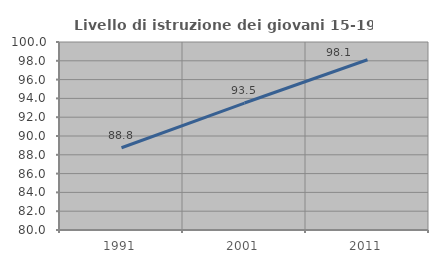
| Category | Livello di istruzione dei giovani 15-19 anni |
|---|---|
| 1991.0 | 88.75 |
| 2001.0 | 93.506 |
| 2011.0 | 98.113 |